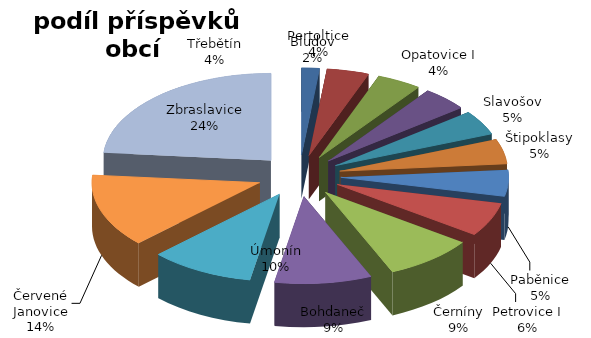
| Category | Series 0 |
|---|---|
| Bludov | 9960 |
| Třebětín | 23490 |
| Opatovice I | 24890 |
| Pertoltice | 25800 |
| Slavošov | 26220 |
| Štipoklasy | 26640 |
| Paběnice | 28180 |
| Petrovice I | 36370 |
| Černíny | 50250 |
| Bohdaneč | 54170 |
| Úmonín | 58020 |
| Červené Janovice | 78620 |
| Zbraslavice | 136810 |